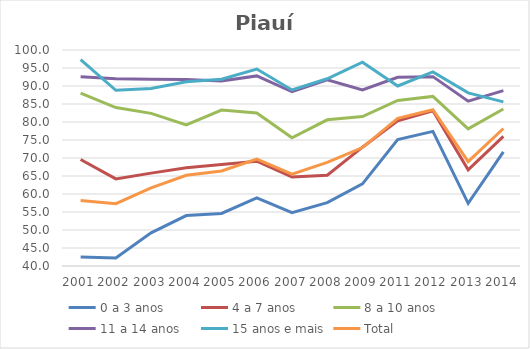
| Category | 0 a 3 anos | 4 a 7 anos | 8 a 10 anos | 11 a 14 anos | 15 anos e mais | Total |
|---|---|---|---|---|---|---|
| 2001.0 | 42.5 | 69.6 | 88 | 92.6 | 97.3 | 58.2 |
| 2002.0 | 42.2 | 64.2 | 84 | 92 | 88.8 | 57.3 |
| 2003.0 | 49.2 | 65.8 | 82.4 | 91.9 | 89.3 | 61.7 |
| 2004.0 | 54 | 67.3 | 79.2 | 91.8 | 91.2 | 65.2 |
| 2005.0 | 54.6 | 68.2 | 83.3 | 91.4 | 91.9 | 66.4 |
| 2006.0 | 58.9 | 69.1 | 82.5 | 92.8 | 94.7 | 69.7 |
| 2007.0 | 54.8 | 64.7 | 75.6 | 88.4 | 88.9 | 65.5 |
| 2008.0 | 57.6 | 65.2 | 80.6 | 91.7 | 92 | 68.8 |
| 2009.0 | 62.8 | 73 | 81.5 | 88.9 | 96.6 | 72.9 |
| 2011.0 | 75.1 | 80.3 | 86 | 92.4 | 90 | 81 |
| 2012.0 | 77.4 | 83.1 | 87.1 | 92.6 | 93.9 | 83.4 |
| 2013.0 | 57.4 | 66.7 | 78.1 | 85.8 | 88.1 | 69 |
| 2014.0 | 71.7 | 76 | 83.6 | 88.7 | 85.6 | 78.2 |